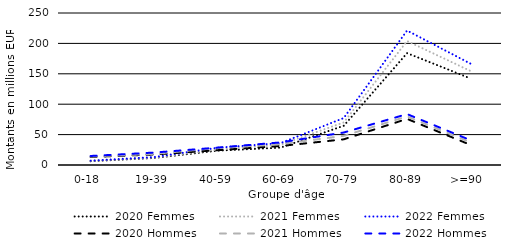
| Category | 2020 Femmes | 2021 Femmes | 2022 Femmes | 2020 Hommes | 2021 Hommes | 2022 Hommes |
|---|---|---|---|---|---|---|
| 0-18  | 6.195 | 6.745 | 7.171 | 13.18 | 13.971 | 14.829 |
| 19-39 | 11.518 | 12.134 | 13.009 | 17.287 | 18.236 | 20.44 |
| 40-59 | 23.558 | 25.339 | 28.337 | 24.337 | 27.956 | 28.564 |
| 60-69 | 28.516 | 33.368 | 35.951 | 31.219 | 34.322 | 37.169 |
| 70-79 | 64.553 | 70.051 | 77.266 | 42.244 | 47.962 | 53.426 |
| 80-89 | 183.965 | 203.877 | 221.142 | 75.824 | 79.845 | 83.73 |
| >=90  | 142.416 | 154.742 | 166.796 | 33.204 | 37.308 | 40.892 |